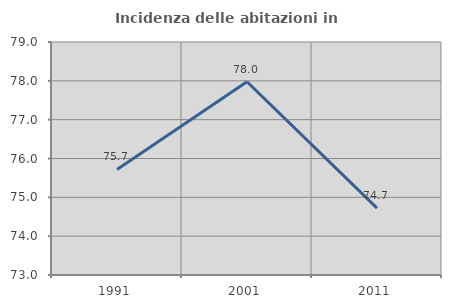
| Category | Incidenza delle abitazioni in proprietà  |
|---|---|
| 1991.0 | 75.718 |
| 2001.0 | 77.978 |
| 2011.0 | 74.722 |